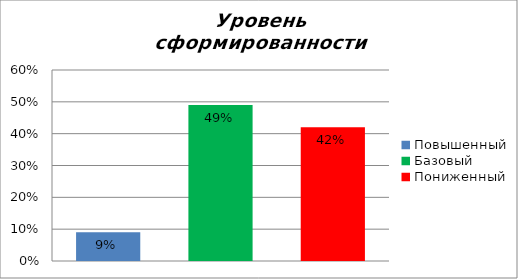
| Category | Уровень сформированности предметных результатов |
|---|---|
| Повышенный | 0.09 |
| Базовый | 0.49 |
| Пониженный | 0.42 |